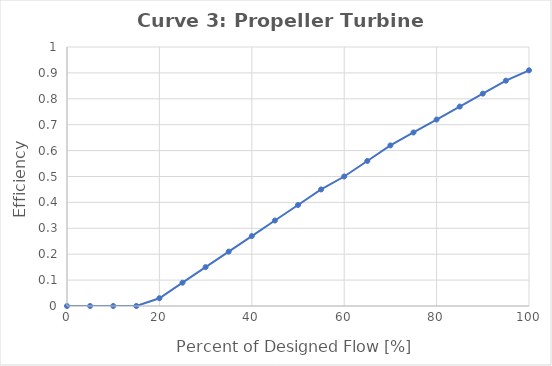
| Category | Series 0 |
|---|---|
| 0.0 | 0 |
| 5.0 | 0 |
| 10.0 | 0 |
| 15.0 | 0 |
| 20.0 | 0.03 |
| 25.0 | 0.09 |
| 30.0 | 0.15 |
| 35.0 | 0.21 |
| 40.0 | 0.27 |
| 45.0 | 0.33 |
| 50.0 | 0.39 |
| 55.0 | 0.45 |
| 60.0 | 0.5 |
| 65.0 | 0.56 |
| 70.0 | 0.62 |
| 75.0 | 0.67 |
| 80.0 | 0.72 |
| 85.0 | 0.77 |
| 90.0 | 0.82 |
| 95.0 | 0.87 |
| 100.0 | 0.91 |